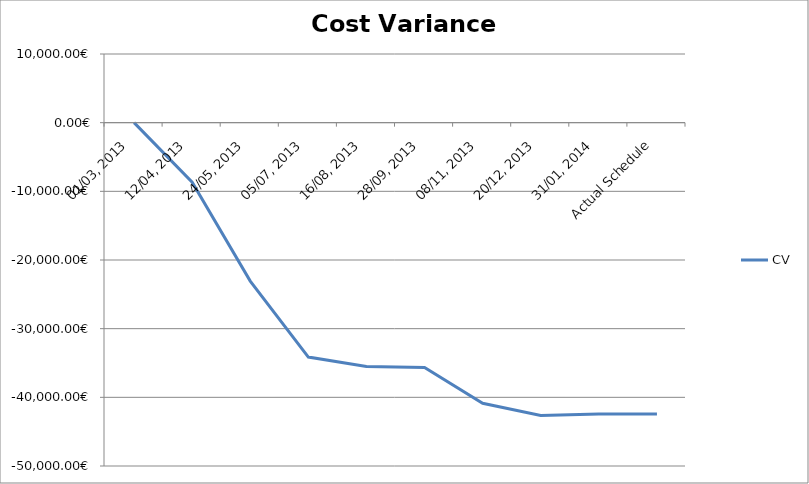
| Category | CV |
|---|---|
| 01/03, 2013 | 0 |
| 12/04, 2013 | -8676.5 |
| 24/05, 2013 | -23070.449 |
| 05/07, 2013 | -34135.867 |
| 16/08, 2013 | -35515.507 |
| 28/09, 2013 | -35664.2 |
| 08/11, 2013 | -40874.04 |
| 20/12, 2013 | -42629 |
| 31/01, 2014 | -42433.8 |
| Actual Schedule | -42433.8 |